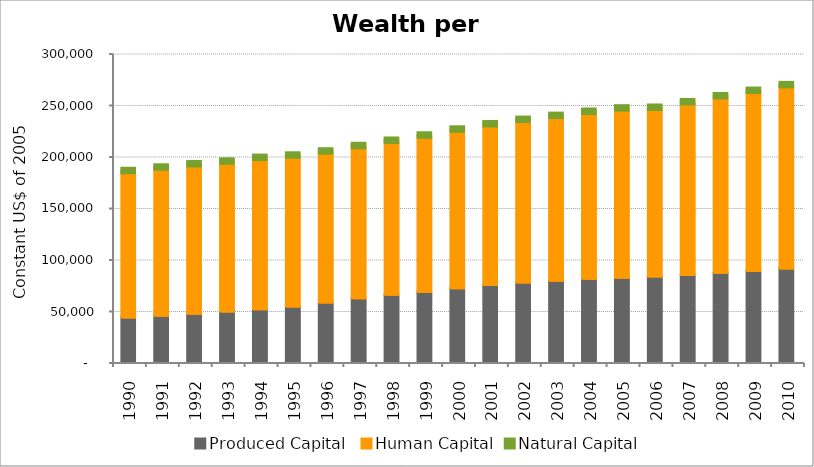
| Category | Produced Capital  | Human Capital | Natural Capital |
|---|---|---|---|
| 1990.0 | 43200.949 | 142451.063 | 11.326 |
| 1991.0 | 44919.41 | 144115.377 | 11.023 |
| 1992.0 | 46823.575 | 145428.556 | 10.708 |
| 1993.0 | 48919.111 | 145940.886 | 10.393 |
| 1994.0 | 51238.824 | 147254.142 | 10.092 |
| 1995.0 | 53950.007 | 146741.312 | 9.813 |
| 1996.0 | 57791.251 | 146845.023 | 9.553 |
| 1997.0 | 61984.908 | 147944.565 | 9.308 |
| 1998.0 | 65360.27 | 149714.169 | 9.084 |
| 1999.0 | 68170.619 | 151961.294 | 8.887 |
| 2000.0 | 71586.856 | 154330.311 | 8.717 |
| 2001.0 | 74808.463 | 156246.705 | 8.582 |
| 2002.0 | 77161.336 | 158214.243 | 8.473 |
| 2003.0 | 78969.979 | 160250.386 | 8.362 |
| 2004.0 | 80809.298 | 162382.014 | 8.213 |
| 2005.0 | 81865.485 | 164555.423 | 8.009 |
| 2006.0 | 82913.847 | 164198.884 | 7.747 |
| 2007.0 | 84486.376 | 168005.679 | 7.452 |
| 2008.0 | 86566.592 | 171727.001 | 7.159 |
| 2009.0 | 88287.303 | 175286.947 | 6.908 |
| 2010.0 | 90683.166 | 178375.271 | 6.717 |